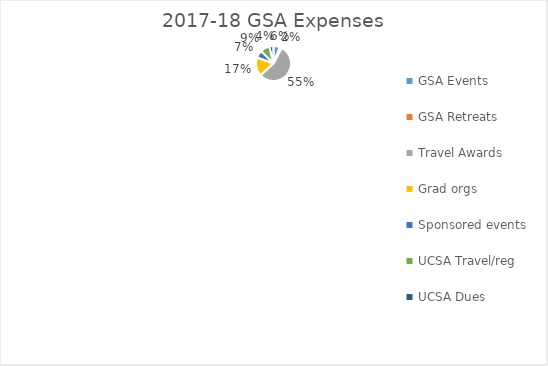
| Category | Series 0 |
|---|---|
| GSA Events | 1000 |
| GSA Retreats | 350 |
| Travel Awards | 9600 |
| Grad orgs | 3000 |
| Sponsored events | 1200 |
| UCSA Travel/reg | 1500 |
| UCSA Dues | 668.2 |